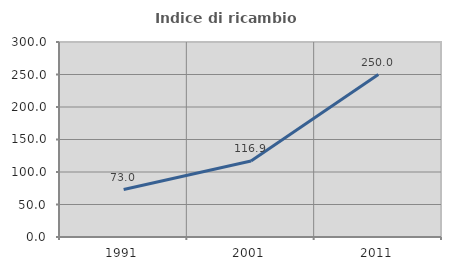
| Category | Indice di ricambio occupazionale  |
|---|---|
| 1991.0 | 73.026 |
| 2001.0 | 116.863 |
| 2011.0 | 250 |